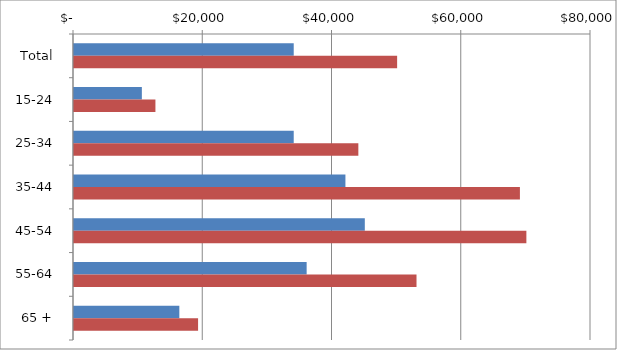
| Category | Series 0 | Series 1 |
|---|---|---|
| Total | 34000 | 50000 |
|  15-24  | 10500 | 12600 |
|  25-34  | 34000 | 44000 |
|  35-44  | 42000 | 69000 |
|  45-54  | 45000 | 70000 |
|  55-64  | 36000 | 53000 |
|  65 +  | 16300 | 19200 |